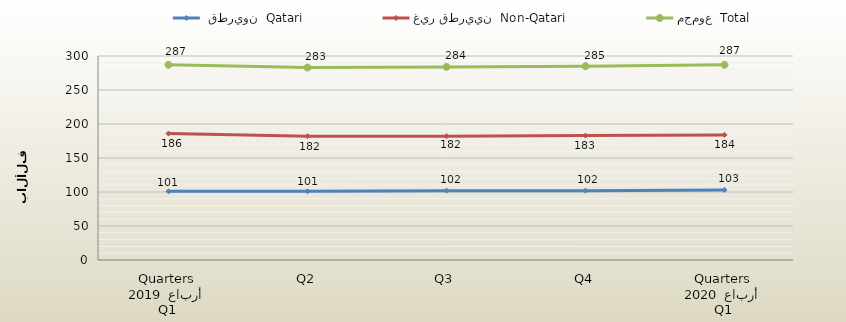
| Category |  قطريون  Qatari | غير قطريين  Non-Qatari | مجموع  Total |
|---|---|---|---|
| 0 | 101 | 186 | 287 |
| 1 | 101 | 182 | 283 |
| 2 | 102 | 182 | 284 |
| 3 | 102 | 183 | 285 |
| 4 | 103 | 184 | 287 |